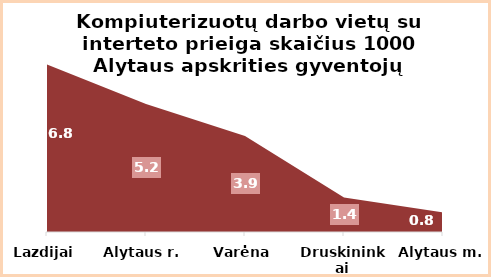
| Category | Series 0 |
|---|---|
| Lazdijai | 6.8 |
| Alytaus r. | 5.2 |
| Varėna | 3.9 |
| Druskininkai | 1.4 |
| Alytaus m. | 0.8 |